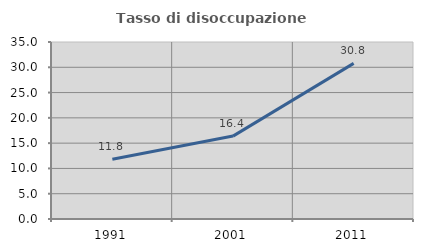
| Category | Tasso di disoccupazione giovanile  |
|---|---|
| 1991.0 | 11.828 |
| 2001.0 | 16.393 |
| 2011.0 | 30.769 |